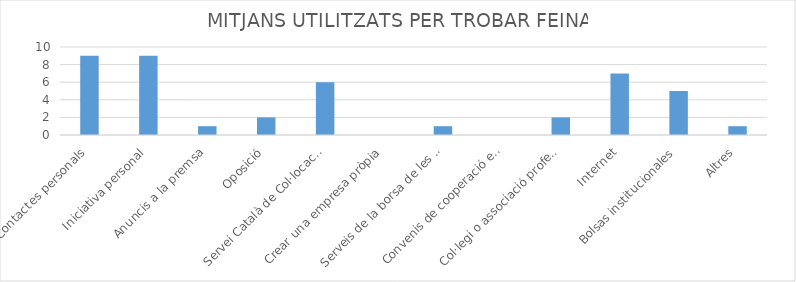
| Category | Series 0 |
|---|---|
| Contactes personals | 9 |
| Iniciativa personal | 9 |
| Anuncis a la premsa | 1 |
| Oposició | 2 |
| Servei Català de Col·locació | 6 |
| Crear una empresa pròpia | 0 |
| Serveis de la borsa de les universitats | 1 |
| Convenis de cooperació educativa | 0 |
| Col·legi o associació professional | 2 |
| Internet | 7 |
| Bolsas institucionales | 5 |
| Altres | 1 |